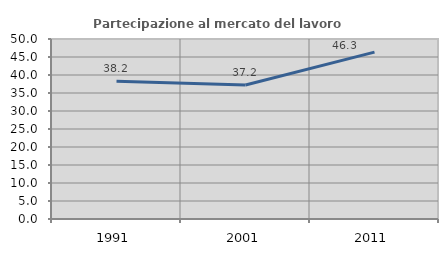
| Category | Partecipazione al mercato del lavoro  femminile |
|---|---|
| 1991.0 | 38.235 |
| 2001.0 | 37.209 |
| 2011.0 | 46.347 |